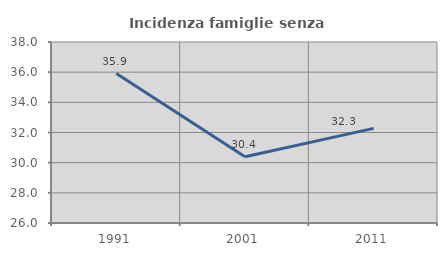
| Category | Incidenza famiglie senza nuclei |
|---|---|
| 1991.0 | 35.912 |
| 2001.0 | 30.387 |
| 2011.0 | 32.273 |